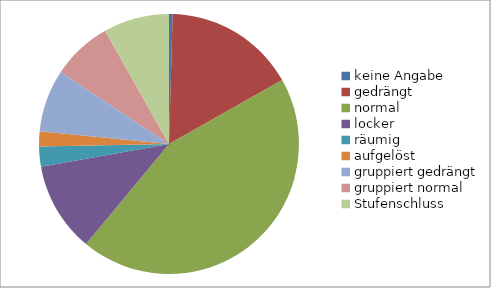
| Category | Kanton Luzern |
|---|---|
| keine Angabe | 0.004 |
| gedrängt | 0.164 |
| normal | 0.442 |
| locker | 0.112 |
| räumig | 0.025 |
| aufgelöst | 0.019 |
| gruppiert gedrängt | 0.078 |
| gruppiert normal | 0.075 |
| Stufenschluss | 0.082 |